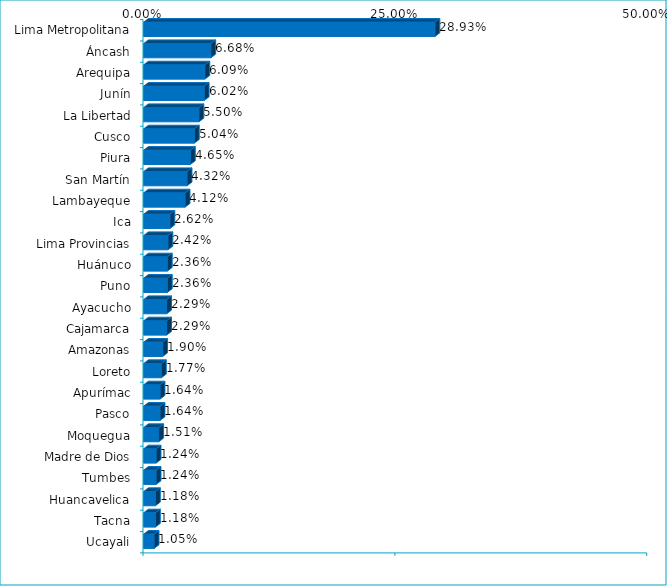
| Category | Series 0 |
|---|---|
| Lima Metropolitana | 0.289 |
| Áncash | 0.067 |
| Arequipa | 0.061 |
| Junín | 0.06 |
| La Libertad | 0.055 |
| Cusco | 0.05 |
| Piura | 0.046 |
| San Martín | 0.043 |
| Lambayeque | 0.041 |
| Ica | 0.026 |
| Lima Provincias | 0.024 |
| Huánuco | 0.024 |
| Puno | 0.024 |
| Ayacucho | 0.023 |
| Cajamarca | 0.023 |
| Amazonas | 0.019 |
| Loreto | 0.018 |
| Apurímac | 0.016 |
| Pasco | 0.016 |
| Moquegua | 0.015 |
| Madre de Dios | 0.012 |
| Tumbes | 0.012 |
| Huancavelica | 0.012 |
| Tacna | 0.012 |
| Ucayali | 0.01 |